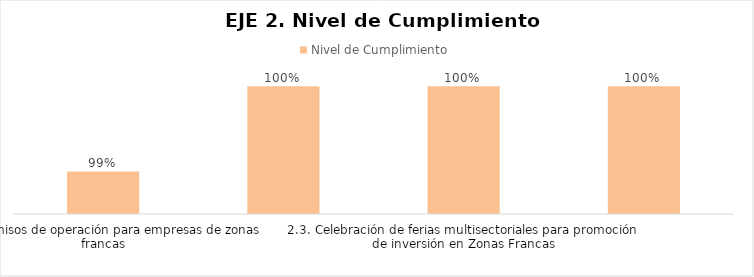
| Category | Nivel de Cumplimiento |
|---|---|
| 2.1. Permisos de operación para empresas de zonas francas | 0.992 |
| 2.2. Estudio de inteligencia comercial para la inserción de los subsectores productivos de zonas francas | 1 |
| 2.3. Celebración de ferias multisectoriales para promoción de inversión en Zonas Francas | 1 |
| 2.4. Creación de clústeres de exportación de bienes y servicios | 1 |